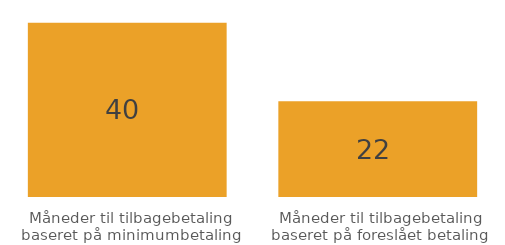
| Category | Series 0 |
|---|---|
| Måneder til tilbagebetaling baseret på minimumbetaling | 40 |
| Måneder til tilbagebetaling baseret på foreslået betaling | 22 |